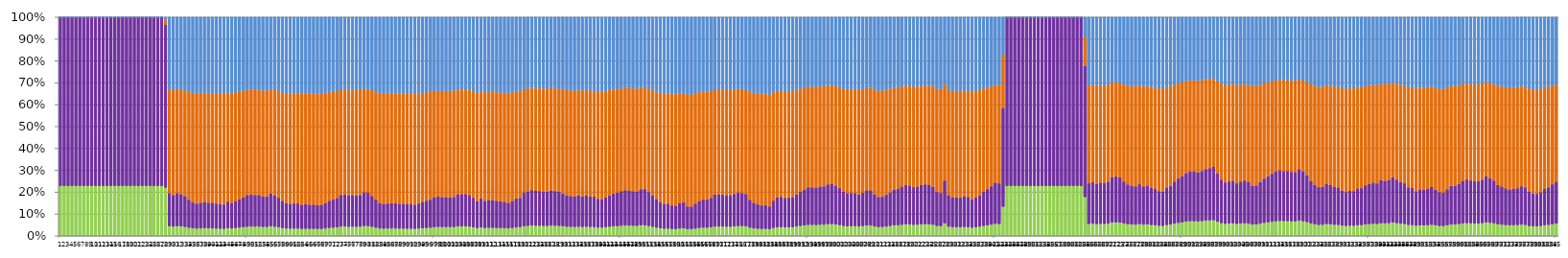
| Category | ВЛ_Корона % | Т_ХХ % | ВЛ_Нагр % | Т_Нагр % |
|---|---|---|---|---|
| 0 | 0.228 | 0.772 | 0 | 0 |
| 1 | 0.228 | 0.772 | 0 | 0 |
| 2 | 0.228 | 0.772 | 0 | 0 |
| 3 | 0.228 | 0.772 | 0 | 0 |
| 4 | 0.228 | 0.772 | 0 | 0 |
| 5 | 0.228 | 0.772 | 0 | 0 |
| 6 | 0.228 | 0.772 | 0 | 0 |
| 7 | 0.228 | 0.772 | 0 | 0 |
| 8 | 0.228 | 0.772 | 0 | 0 |
| 9 | 0.228 | 0.772 | 0 | 0 |
| 10 | 0.228 | 0.772 | 0 | 0 |
| 11 | 0.228 | 0.772 | 0 | 0 |
| 12 | 0.228 | 0.772 | 0 | 0 |
| 13 | 0.228 | 0.772 | 0 | 0 |
| 14 | 0.228 | 0.772 | 0 | 0 |
| 15 | 0.228 | 0.772 | 0 | 0 |
| 16 | 0.228 | 0.772 | 0 | 0 |
| 17 | 0.228 | 0.772 | 0 | 0 |
| 18 | 0.228 | 0.772 | 0 | 0 |
| 19 | 0.228 | 0.772 | 0 | 0 |
| 20 | 0.228 | 0.772 | 0 | 0 |
| 21 | 0.228 | 0.772 | 0 | 0 |
| 22 | 0.228 | 0.772 | 0 | 0 |
| 23 | 0.228 | 0.772 | 0 | 0 |
| 24 | 0.228 | 0.772 | 0 | 0 |
| 25 | 0.228 | 0.772 | 0 | 0 |
| 26 | 0.228 | 0.772 | 0 | 0 |
| 27 | 0.221 | 0.746 | 0.02 | 0.014 |
| 28 | 0.045 | 0.151 | 0.475 | 0.329 |
| 29 | 0.043 | 0.144 | 0.48 | 0.333 |
| 30 | 0.045 | 0.151 | 0.475 | 0.329 |
| 31 | 0.044 | 0.147 | 0.478 | 0.331 |
| 32 | 0.041 | 0.139 | 0.484 | 0.335 |
| 33 | 0.038 | 0.128 | 0.493 | 0.341 |
| 34 | 0.035 | 0.118 | 0.501 | 0.346 |
| 35 | 0.034 | 0.114 | 0.504 | 0.349 |
| 36 | 0.034 | 0.117 | 0.502 | 0.347 |
| 37 | 0.036 | 0.12 | 0.499 | 0.345 |
| 38 | 0.035 | 0.117 | 0.501 | 0.347 |
| 39 | 0.035 | 0.117 | 0.501 | 0.347 |
| 40 | 0.034 | 0.114 | 0.504 | 0.348 |
| 41 | 0.033 | 0.113 | 0.505 | 0.349 |
| 42 | 0.033 | 0.111 | 0.506 | 0.35 |
| 43 | 0.036 | 0.121 | 0.498 | 0.345 |
| 44 | 0.034 | 0.116 | 0.502 | 0.348 |
| 45 | 0.036 | 0.123 | 0.497 | 0.344 |
| 46 | 0.038 | 0.13 | 0.492 | 0.34 |
| 47 | 0.04 | 0.135 | 0.487 | 0.337 |
| 48 | 0.043 | 0.144 | 0.481 | 0.333 |
| 49 | 0.043 | 0.146 | 0.479 | 0.332 |
| 50 | 0.043 | 0.144 | 0.481 | 0.333 |
| 51 | 0.043 | 0.145 | 0.48 | 0.333 |
| 52 | 0.041 | 0.139 | 0.484 | 0.335 |
| 53 | 0.041 | 0.139 | 0.485 | 0.336 |
| 54 | 0.044 | 0.15 | 0.476 | 0.33 |
| 55 | 0.042 | 0.143 | 0.482 | 0.334 |
| 56 | 0.04 | 0.135 | 0.488 | 0.338 |
| 57 | 0.037 | 0.123 | 0.496 | 0.344 |
| 58 | 0.034 | 0.116 | 0.502 | 0.348 |
| 59 | 0.034 | 0.113 | 0.504 | 0.349 |
| 60 | 0.034 | 0.115 | 0.503 | 0.348 |
| 61 | 0.034 | 0.114 | 0.503 | 0.348 |
| 62 | 0.032 | 0.11 | 0.507 | 0.351 |
| 63 | 0.033 | 0.112 | 0.505 | 0.35 |
| 64 | 0.033 | 0.11 | 0.507 | 0.351 |
| 65 | 0.033 | 0.111 | 0.506 | 0.35 |
| 66 | 0.032 | 0.108 | 0.508 | 0.352 |
| 67 | 0.032 | 0.11 | 0.507 | 0.351 |
| 68 | 0.034 | 0.115 | 0.503 | 0.348 |
| 69 | 0.037 | 0.123 | 0.496 | 0.344 |
| 70 | 0.038 | 0.128 | 0.493 | 0.341 |
| 71 | 0.04 | 0.133 | 0.489 | 0.338 |
| 72 | 0.043 | 0.144 | 0.48 | 0.333 |
| 73 | 0.043 | 0.146 | 0.479 | 0.332 |
| 74 | 0.042 | 0.142 | 0.482 | 0.334 |
| 75 | 0.043 | 0.144 | 0.481 | 0.333 |
| 76 | 0.042 | 0.142 | 0.482 | 0.334 |
| 77 | 0.043 | 0.144 | 0.48 | 0.333 |
| 78 | 0.046 | 0.154 | 0.473 | 0.328 |
| 79 | 0.045 | 0.154 | 0.473 | 0.328 |
| 80 | 0.042 | 0.141 | 0.483 | 0.334 |
| 81 | 0.038 | 0.128 | 0.493 | 0.341 |
| 82 | 0.034 | 0.116 | 0.502 | 0.348 |
| 83 | 0.033 | 0.113 | 0.505 | 0.349 |
| 84 | 0.034 | 0.114 | 0.504 | 0.348 |
| 85 | 0.034 | 0.115 | 0.503 | 0.348 |
| 86 | 0.034 | 0.116 | 0.503 | 0.348 |
| 87 | 0.033 | 0.113 | 0.504 | 0.349 |
| 88 | 0.034 | 0.113 | 0.504 | 0.349 |
| 89 | 0.033 | 0.113 | 0.505 | 0.349 |
| 90 | 0.033 | 0.113 | 0.505 | 0.349 |
| 91 | 0.033 | 0.11 | 0.507 | 0.351 |
| 92 | 0.034 | 0.115 | 0.503 | 0.348 |
| 93 | 0.035 | 0.12 | 0.499 | 0.346 |
| 94 | 0.037 | 0.124 | 0.496 | 0.343 |
| 95 | 0.038 | 0.128 | 0.493 | 0.341 |
| 96 | 0.04 | 0.136 | 0.487 | 0.337 |
| 97 | 0.041 | 0.139 | 0.484 | 0.335 |
| 98 | 0.04 | 0.136 | 0.487 | 0.337 |
| 99 | 0.04 | 0.137 | 0.486 | 0.337 |
| 100 | 0.04 | 0.136 | 0.487 | 0.337 |
| 101 | 0.041 | 0.137 | 0.486 | 0.337 |
| 102 | 0.044 | 0.147 | 0.478 | 0.331 |
| 103 | 0.044 | 0.147 | 0.478 | 0.331 |
| 104 | 0.044 | 0.147 | 0.478 | 0.331 |
| 105 | 0.043 | 0.144 | 0.481 | 0.333 |
| 106 | 0.04 | 0.135 | 0.488 | 0.338 |
| 107 | 0.036 | 0.122 | 0.498 | 0.344 |
| 108 | 0.039 | 0.132 | 0.49 | 0.339 |
| 109 | 0.037 | 0.124 | 0.496 | 0.343 |
| 110 | 0.037 | 0.126 | 0.494 | 0.342 |
| 111 | 0.037 | 0.126 | 0.494 | 0.342 |
| 112 | 0.037 | 0.124 | 0.496 | 0.343 |
| 113 | 0.036 | 0.122 | 0.498 | 0.344 |
| 114 | 0.035 | 0.12 | 0.499 | 0.346 |
| 115 | 0.035 | 0.117 | 0.502 | 0.347 |
| 116 | 0.036 | 0.123 | 0.497 | 0.344 |
| 117 | 0.039 | 0.132 | 0.49 | 0.339 |
| 118 | 0.04 | 0.134 | 0.488 | 0.338 |
| 119 | 0.045 | 0.152 | 0.474 | 0.328 |
| 120 | 0.046 | 0.157 | 0.471 | 0.326 |
| 121 | 0.048 | 0.162 | 0.467 | 0.323 |
| 122 | 0.047 | 0.159 | 0.469 | 0.325 |
| 123 | 0.047 | 0.158 | 0.47 | 0.325 |
| 124 | 0.046 | 0.155 | 0.472 | 0.327 |
| 125 | 0.046 | 0.156 | 0.472 | 0.327 |
| 126 | 0.047 | 0.16 | 0.468 | 0.324 |
| 127 | 0.047 | 0.158 | 0.47 | 0.325 |
| 128 | 0.046 | 0.156 | 0.471 | 0.327 |
| 129 | 0.044 | 0.149 | 0.477 | 0.33 |
| 130 | 0.042 | 0.143 | 0.482 | 0.334 |
| 131 | 0.042 | 0.141 | 0.483 | 0.335 |
| 132 | 0.041 | 0.139 | 0.484 | 0.335 |
| 133 | 0.042 | 0.142 | 0.482 | 0.334 |
| 134 | 0.041 | 0.139 | 0.484 | 0.335 |
| 135 | 0.042 | 0.143 | 0.481 | 0.333 |
| 136 | 0.041 | 0.139 | 0.485 | 0.336 |
| 137 | 0.041 | 0.139 | 0.485 | 0.336 |
| 138 | 0.039 | 0.131 | 0.491 | 0.34 |
| 139 | 0.038 | 0.129 | 0.492 | 0.34 |
| 140 | 0.04 | 0.135 | 0.487 | 0.337 |
| 141 | 0.042 | 0.143 | 0.481 | 0.333 |
| 142 | 0.044 | 0.149 | 0.476 | 0.33 |
| 143 | 0.045 | 0.152 | 0.474 | 0.329 |
| 144 | 0.047 | 0.158 | 0.47 | 0.325 |
| 145 | 0.048 | 0.161 | 0.467 | 0.324 |
| 146 | 0.047 | 0.159 | 0.469 | 0.325 |
| 147 | 0.047 | 0.158 | 0.47 | 0.326 |
| 148 | 0.046 | 0.157 | 0.471 | 0.326 |
| 149 | 0.049 | 0.165 | 0.464 | 0.322 |
| 150 | 0.049 | 0.165 | 0.464 | 0.322 |
| 151 | 0.046 | 0.155 | 0.472 | 0.327 |
| 152 | 0.042 | 0.143 | 0.482 | 0.334 |
| 153 | 0.038 | 0.129 | 0.492 | 0.34 |
| 154 | 0.035 | 0.119 | 0.5 | 0.346 |
| 155 | 0.033 | 0.113 | 0.505 | 0.349 |
| 156 | 0.034 | 0.114 | 0.504 | 0.349 |
| 157 | 0.032 | 0.108 | 0.509 | 0.352 |
| 158 | 0.031 | 0.106 | 0.51 | 0.352 |
| 159 | 0.034 | 0.116 | 0.503 | 0.348 |
| 160 | 0.035 | 0.118 | 0.501 | 0.346 |
| 161 | 0.031 | 0.104 | 0.511 | 0.354 |
| 162 | 0.031 | 0.104 | 0.512 | 0.354 |
| 163 | 0.034 | 0.114 | 0.504 | 0.349 |
| 164 | 0.036 | 0.123 | 0.497 | 0.344 |
| 165 | 0.038 | 0.128 | 0.493 | 0.341 |
| 166 | 0.038 | 0.128 | 0.493 | 0.341 |
| 167 | 0.04 | 0.134 | 0.488 | 0.338 |
| 168 | 0.043 | 0.146 | 0.479 | 0.332 |
| 169 | 0.043 | 0.146 | 0.479 | 0.332 |
| 170 | 0.043 | 0.145 | 0.48 | 0.332 |
| 171 | 0.043 | 0.144 | 0.481 | 0.333 |
| 172 | 0.042 | 0.143 | 0.481 | 0.333 |
| 173 | 0.044 | 0.148 | 0.477 | 0.331 |
| 174 | 0.045 | 0.153 | 0.473 | 0.328 |
| 175 | 0.045 | 0.151 | 0.475 | 0.329 |
| 176 | 0.044 | 0.148 | 0.477 | 0.331 |
| 177 | 0.038 | 0.128 | 0.493 | 0.341 |
| 178 | 0.035 | 0.117 | 0.501 | 0.347 |
| 179 | 0.033 | 0.111 | 0.506 | 0.35 |
| 180 | 0.032 | 0.107 | 0.509 | 0.352 |
| 181 | 0.032 | 0.109 | 0.508 | 0.351 |
| 182 | 0.031 | 0.104 | 0.511 | 0.354 |
| 183 | 0.037 | 0.124 | 0.496 | 0.343 |
| 184 | 0.04 | 0.135 | 0.487 | 0.337 |
| 185 | 0.041 | 0.138 | 0.485 | 0.336 |
| 186 | 0.04 | 0.134 | 0.489 | 0.338 |
| 187 | 0.04 | 0.135 | 0.488 | 0.338 |
| 188 | 0.04 | 0.136 | 0.487 | 0.337 |
| 189 | 0.043 | 0.146 | 0.479 | 0.332 |
| 190 | 0.046 | 0.155 | 0.472 | 0.327 |
| 191 | 0.048 | 0.163 | 0.466 | 0.323 |
| 192 | 0.051 | 0.172 | 0.459 | 0.318 |
| 193 | 0.051 | 0.172 | 0.459 | 0.318 |
| 194 | 0.05 | 0.169 | 0.461 | 0.32 |
| 195 | 0.051 | 0.174 | 0.457 | 0.317 |
| 196 | 0.052 | 0.175 | 0.457 | 0.317 |
| 197 | 0.054 | 0.182 | 0.451 | 0.313 |
| 198 | 0.054 | 0.184 | 0.45 | 0.312 |
| 199 | 0.052 | 0.177 | 0.455 | 0.316 |
| 200 | 0.05 | 0.169 | 0.461 | 0.32 |
| 201 | 0.046 | 0.156 | 0.472 | 0.327 |
| 202 | 0.045 | 0.151 | 0.475 | 0.329 |
| 203 | 0.045 | 0.152 | 0.475 | 0.329 |
| 204 | 0.045 | 0.152 | 0.475 | 0.329 |
| 205 | 0.043 | 0.146 | 0.479 | 0.332 |
| 206 | 0.045 | 0.153 | 0.474 | 0.328 |
| 207 | 0.048 | 0.161 | 0.467 | 0.324 |
| 208 | 0.048 | 0.161 | 0.468 | 0.324 |
| 209 | 0.044 | 0.147 | 0.478 | 0.331 |
| 210 | 0.041 | 0.137 | 0.486 | 0.336 |
| 211 | 0.041 | 0.138 | 0.485 | 0.336 |
| 212 | 0.043 | 0.145 | 0.48 | 0.332 |
| 213 | 0.045 | 0.153 | 0.474 | 0.328 |
| 214 | 0.048 | 0.163 | 0.466 | 0.323 |
| 215 | 0.049 | 0.166 | 0.463 | 0.321 |
| 216 | 0.051 | 0.174 | 0.458 | 0.317 |
| 217 | 0.053 | 0.18 | 0.453 | 0.314 |
| 218 | 0.052 | 0.177 | 0.455 | 0.316 |
| 219 | 0.051 | 0.172 | 0.459 | 0.318 |
| 220 | 0.052 | 0.174 | 0.457 | 0.317 |
| 221 | 0.053 | 0.18 | 0.453 | 0.314 |
| 222 | 0.054 | 0.182 | 0.452 | 0.313 |
| 223 | 0.053 | 0.18 | 0.452 | 0.314 |
| 224 | 0.051 | 0.174 | 0.458 | 0.317 |
| 225 | 0.046 | 0.155 | 0.472 | 0.327 |
| 226 | 0.045 | 0.152 | 0.475 | 0.329 |
| 227 | 0.058 | 0.196 | 0.441 | 0.306 |
| 228 | 0.043 | 0.144 | 0.481 | 0.333 |
| 229 | 0.04 | 0.136 | 0.487 | 0.337 |
| 230 | 0.04 | 0.136 | 0.486 | 0.337 |
| 231 | 0.04 | 0.135 | 0.488 | 0.338 |
| 232 | 0.041 | 0.139 | 0.484 | 0.335 |
| 233 | 0.041 | 0.138 | 0.485 | 0.336 |
| 234 | 0.038 | 0.128 | 0.493 | 0.341 |
| 235 | 0.04 | 0.135 | 0.487 | 0.337 |
| 236 | 0.042 | 0.143 | 0.481 | 0.333 |
| 237 | 0.046 | 0.156 | 0.472 | 0.327 |
| 238 | 0.049 | 0.165 | 0.464 | 0.322 |
| 239 | 0.052 | 0.175 | 0.457 | 0.316 |
| 240 | 0.056 | 0.188 | 0.447 | 0.31 |
| 241 | 0.055 | 0.186 | 0.448 | 0.311 |
| 242 | 0.134 | 0.452 | 0.245 | 0.17 |
| 243 | 0.228 | 0.772 | 0 | 0 |
| 244 | 0.228 | 0.772 | 0 | 0 |
| 245 | 0.228 | 0.772 | 0 | 0 |
| 246 | 0.228 | 0.772 | 0 | 0 |
| 247 | 0.228 | 0.772 | 0 | 0 |
| 248 | 0.228 | 0.772 | 0 | 0 |
| 249 | 0.228 | 0.772 | 0 | 0 |
| 250 | 0.228 | 0.772 | 0 | 0 |
| 251 | 0.228 | 0.772 | 0 | 0 |
| 252 | 0.228 | 0.772 | 0 | 0 |
| 253 | 0.228 | 0.772 | 0 | 0 |
| 254 | 0.228 | 0.772 | 0 | 0 |
| 255 | 0.228 | 0.772 | 0 | 0 |
| 256 | 0.228 | 0.772 | 0 | 0 |
| 257 | 0.228 | 0.772 | 0 | 0 |
| 258 | 0.228 | 0.772 | 0 | 0 |
| 259 | 0.228 | 0.772 | 0 | 0 |
| 260 | 0.228 | 0.772 | 0 | 0 |
| 261 | 0.228 | 0.772 | 0 | 0 |
| 262 | 0.228 | 0.772 | 0 | 0 |
| 263 | 0.178 | 0.6 | 0.131 | 0.091 |
| 264 | 0.055 | 0.186 | 0.448 | 0.311 |
| 265 | 0.056 | 0.19 | 0.445 | 0.309 |
| 266 | 0.054 | 0.183 | 0.45 | 0.312 |
| 267 | 0.056 | 0.188 | 0.447 | 0.31 |
| 268 | 0.055 | 0.186 | 0.448 | 0.311 |
| 269 | 0.057 | 0.191 | 0.444 | 0.308 |
| 270 | 0.061 | 0.208 | 0.432 | 0.299 |
| 271 | 0.062 | 0.21 | 0.43 | 0.298 |
| 272 | 0.061 | 0.206 | 0.433 | 0.3 |
| 273 | 0.057 | 0.192 | 0.444 | 0.308 |
| 274 | 0.054 | 0.182 | 0.452 | 0.313 |
| 275 | 0.052 | 0.177 | 0.455 | 0.315 |
| 276 | 0.052 | 0.175 | 0.457 | 0.317 |
| 277 | 0.054 | 0.182 | 0.451 | 0.313 |
| 278 | 0.052 | 0.175 | 0.457 | 0.317 |
| 279 | 0.052 | 0.177 | 0.455 | 0.315 |
| 280 | 0.05 | 0.17 | 0.461 | 0.319 |
| 281 | 0.049 | 0.166 | 0.463 | 0.321 |
| 282 | 0.047 | 0.158 | 0.47 | 0.325 |
| 283 | 0.046 | 0.156 | 0.471 | 0.327 |
| 284 | 0.05 | 0.171 | 0.46 | 0.319 |
| 285 | 0.052 | 0.176 | 0.456 | 0.316 |
| 286 | 0.057 | 0.192 | 0.444 | 0.308 |
| 287 | 0.06 | 0.203 | 0.435 | 0.302 |
| 288 | 0.062 | 0.21 | 0.43 | 0.298 |
| 289 | 0.066 | 0.221 | 0.421 | 0.292 |
| 290 | 0.067 | 0.228 | 0.416 | 0.289 |
| 291 | 0.067 | 0.228 | 0.416 | 0.289 |
| 292 | 0.066 | 0.224 | 0.419 | 0.291 |
| 293 | 0.068 | 0.228 | 0.416 | 0.288 |
| 294 | 0.07 | 0.236 | 0.41 | 0.285 |
| 295 | 0.071 | 0.239 | 0.407 | 0.283 |
| 296 | 0.072 | 0.244 | 0.404 | 0.28 |
| 297 | 0.065 | 0.22 | 0.422 | 0.293 |
| 298 | 0.059 | 0.199 | 0.438 | 0.304 |
| 299 | 0.056 | 0.188 | 0.446 | 0.309 |
| 300 | 0.057 | 0.193 | 0.443 | 0.307 |
| 301 | 0.058 | 0.195 | 0.441 | 0.306 |
| 302 | 0.055 | 0.186 | 0.448 | 0.311 |
| 303 | 0.057 | 0.192 | 0.444 | 0.308 |
| 304 | 0.058 | 0.196 | 0.441 | 0.306 |
| 305 | 0.056 | 0.19 | 0.445 | 0.309 |
| 306 | 0.052 | 0.176 | 0.456 | 0.316 |
| 307 | 0.053 | 0.178 | 0.455 | 0.315 |
| 308 | 0.056 | 0.19 | 0.445 | 0.309 |
| 309 | 0.06 | 0.202 | 0.436 | 0.302 |
| 310 | 0.062 | 0.21 | 0.43 | 0.298 |
| 311 | 0.065 | 0.219 | 0.423 | 0.293 |
| 312 | 0.067 | 0.227 | 0.417 | 0.289 |
| 313 | 0.069 | 0.232 | 0.413 | 0.287 |
| 314 | 0.068 | 0.229 | 0.415 | 0.288 |
| 315 | 0.068 | 0.229 | 0.415 | 0.288 |
| 316 | 0.067 | 0.226 | 0.417 | 0.29 |
| 317 | 0.067 | 0.225 | 0.418 | 0.29 |
| 318 | 0.07 | 0.235 | 0.41 | 0.285 |
| 319 | 0.067 | 0.227 | 0.416 | 0.289 |
| 320 | 0.063 | 0.214 | 0.427 | 0.296 |
| 321 | 0.057 | 0.194 | 0.442 | 0.307 |
| 322 | 0.053 | 0.18 | 0.453 | 0.314 |
| 323 | 0.051 | 0.172 | 0.459 | 0.318 |
| 324 | 0.051 | 0.173 | 0.459 | 0.318 |
| 325 | 0.055 | 0.185 | 0.449 | 0.311 |
| 326 | 0.053 | 0.18 | 0.453 | 0.314 |
| 327 | 0.051 | 0.173 | 0.458 | 0.318 |
| 328 | 0.051 | 0.171 | 0.46 | 0.319 |
| 329 | 0.047 | 0.16 | 0.468 | 0.324 |
| 330 | 0.046 | 0.155 | 0.472 | 0.327 |
| 331 | 0.047 | 0.159 | 0.469 | 0.325 |
| 332 | 0.047 | 0.158 | 0.47 | 0.325 |
| 333 | 0.05 | 0.167 | 0.463 | 0.321 |
| 334 | 0.05 | 0.169 | 0.462 | 0.32 |
| 335 | 0.053 | 0.179 | 0.454 | 0.315 |
| 336 | 0.054 | 0.183 | 0.451 | 0.312 |
| 337 | 0.056 | 0.188 | 0.447 | 0.31 |
| 338 | 0.055 | 0.185 | 0.449 | 0.311 |
| 339 | 0.058 | 0.196 | 0.44 | 0.305 |
| 340 | 0.057 | 0.193 | 0.443 | 0.307 |
| 341 | 0.058 | 0.197 | 0.439 | 0.305 |
| 342 | 0.061 | 0.207 | 0.432 | 0.3 |
| 343 | 0.059 | 0.198 | 0.439 | 0.304 |
| 344 | 0.056 | 0.19 | 0.445 | 0.309 |
| 345 | 0.055 | 0.186 | 0.448 | 0.311 |
| 346 | 0.051 | 0.172 | 0.459 | 0.318 |
| 347 | 0.05 | 0.169 | 0.461 | 0.32 |
| 348 | 0.047 | 0.158 | 0.47 | 0.326 |
| 349 | 0.049 | 0.164 | 0.465 | 0.322 |
| 350 | 0.048 | 0.163 | 0.466 | 0.323 |
| 351 | 0.049 | 0.166 | 0.464 | 0.321 |
| 352 | 0.051 | 0.173 | 0.458 | 0.318 |
| 353 | 0.048 | 0.163 | 0.466 | 0.323 |
| 354 | 0.046 | 0.155 | 0.472 | 0.327 |
| 355 | 0.045 | 0.152 | 0.474 | 0.328 |
| 356 | 0.049 | 0.165 | 0.464 | 0.322 |
| 357 | 0.052 | 0.176 | 0.456 | 0.316 |
| 358 | 0.052 | 0.176 | 0.456 | 0.316 |
| 359 | 0.054 | 0.184 | 0.45 | 0.312 |
| 360 | 0.057 | 0.194 | 0.442 | 0.307 |
| 361 | 0.059 | 0.199 | 0.438 | 0.304 |
| 362 | 0.058 | 0.196 | 0.441 | 0.306 |
| 363 | 0.057 | 0.193 | 0.443 | 0.307 |
| 364 | 0.057 | 0.193 | 0.443 | 0.307 |
| 365 | 0.059 | 0.198 | 0.439 | 0.304 |
| 366 | 0.062 | 0.211 | 0.429 | 0.298 |
| 367 | 0.06 | 0.204 | 0.434 | 0.301 |
| 368 | 0.058 | 0.195 | 0.441 | 0.306 |
| 369 | 0.053 | 0.18 | 0.453 | 0.314 |
| 370 | 0.052 | 0.174 | 0.457 | 0.317 |
| 371 | 0.05 | 0.168 | 0.462 | 0.32 |
| 372 | 0.048 | 0.163 | 0.466 | 0.323 |
| 373 | 0.049 | 0.166 | 0.463 | 0.321 |
| 374 | 0.05 | 0.169 | 0.462 | 0.32 |
| 375 | 0.052 | 0.175 | 0.457 | 0.317 |
| 376 | 0.051 | 0.171 | 0.459 | 0.318 |
| 377 | 0.046 | 0.156 | 0.471 | 0.326 |
| 378 | 0.044 | 0.15 | 0.476 | 0.33 |
| 379 | 0.044 | 0.149 | 0.477 | 0.33 |
| 380 | 0.046 | 0.154 | 0.473 | 0.328 |
| 381 | 0.049 | 0.166 | 0.463 | 0.321 |
| 382 | 0.051 | 0.171 | 0.459 | 0.318 |
| 383 | 0.054 | 0.182 | 0.451 | 0.313 |
| 384 | 0.057 | 0.191 | 0.444 | 0.308 |